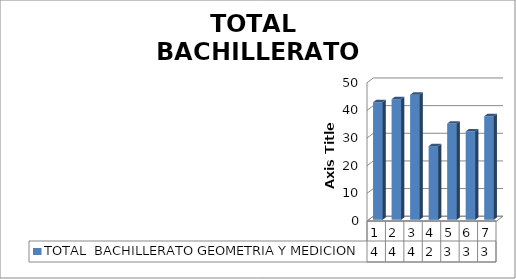
| Category | TOTAL  BACHILLERATO GEOMETRIA Y MEDICION |
|---|---|
| 0 | 42.54 |
| 1 | 43.64 |
| 2 | 45.22 |
| 3 | 26.66 |
| 4 | 34.81 |
| 5 | 32 |
| 6 | 37.478 |